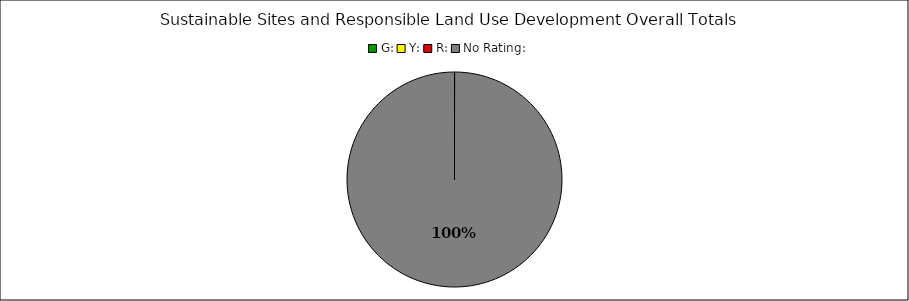
| Category | Series 0 |
|---|---|
| G: | 0 |
| Y: | 0 |
| R: | 0 |
| No Rating: | 19 |